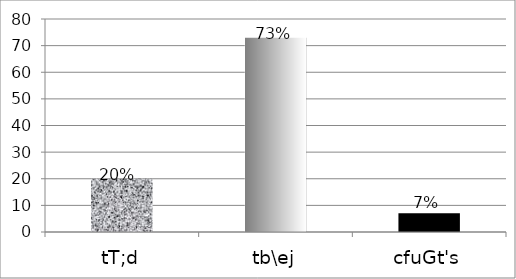
| Category | Series 0 |
|---|---|
| tT;d | 20 |
| tb\ej | 73 |
| cfuGt's | 7 |